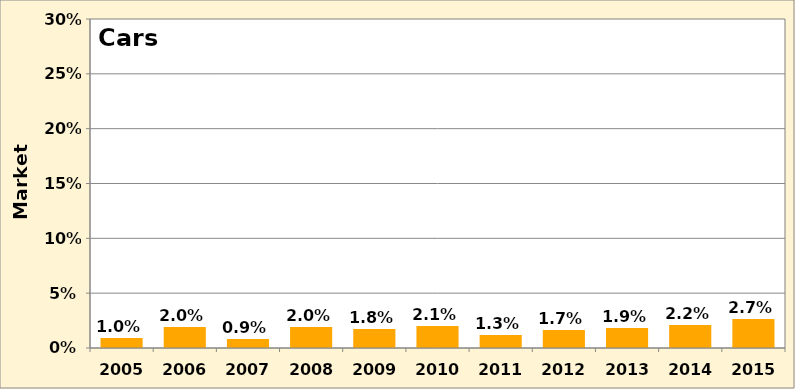
| Category | Series 0 |
|---|---|
| 2005.0 | 0.01 |
| 2006.0 | 0.02 |
| 2007.0 | 0.009 |
| 2008.0 | 0.02 |
| 2009.0 | 0.018 |
| 2010.0 | 0.021 |
| 2011.0 | 0.013 |
| 2012.0 | 0.017 |
| 2013.0 | 0.019 |
| 2014.0 | 0.022 |
| 2015.0 | 0.027 |